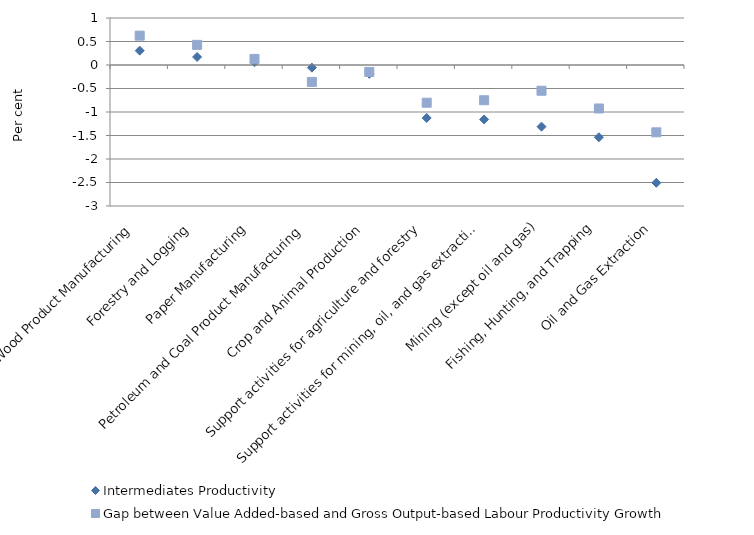
| Category | Intermediates Productivity | Gap between Value Added-based and Gross Output-based Labour Productivity Growth |
|---|---|---|
| Wood Product Manufacturing | 0.305 | 0.624 |
| Forestry and Logging | 0.172 | 0.429 |
| Paper Manufacturing | 0.059 | 0.13 |
| Petroleum and Coal Product Manufacturing | -0.056 | -0.36 |
| Crop and Animal Production | -0.188 | -0.147 |
| Support activities for agriculture and forestry | -1.127 | -0.803 |
| Support activities for mining, oil, and gas extraction | -1.158 | -0.75 |
| Mining (except oil and gas) | -1.312 | -0.547 |
| Fishing, Hunting, and Trapping | -1.538 | -0.925 |
| Oil and Gas Extraction | -2.506 | -1.432 |